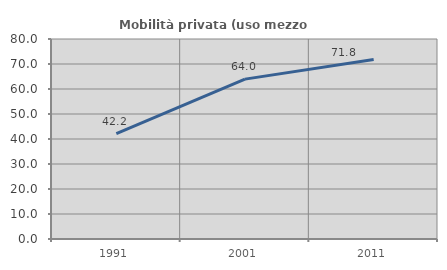
| Category | Mobilità privata (uso mezzo privato) |
|---|---|
| 1991.0 | 42.188 |
| 2001.0 | 63.953 |
| 2011.0 | 71.789 |